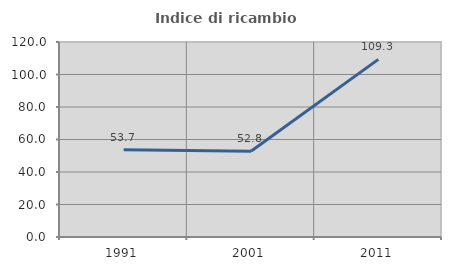
| Category | Indice di ricambio occupazionale  |
|---|---|
| 1991.0 | 53.731 |
| 2001.0 | 52.778 |
| 2011.0 | 109.302 |